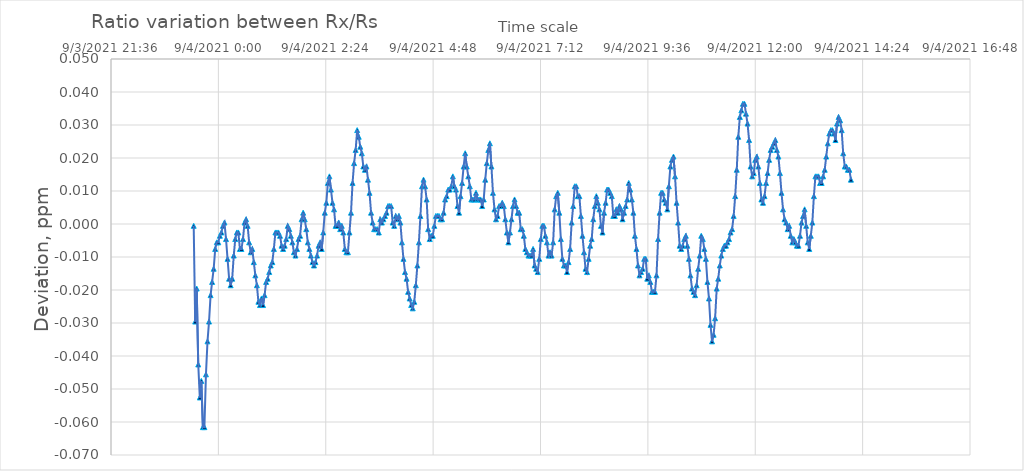
| Category | ratio |
|---|---|
| 44442.977013888885 | -0.001 |
| 44442.9783912037 | -0.03 |
| 44442.97982638889 | -0.02 |
| 44442.981261574074 | -0.043 |
| 44442.98269675926 | -0.053 |
| 44442.984131944446 | -0.048 |
| 44442.98556712963 | -0.062 |
| 44442.98700231482 | -0.062 |
| 44442.9884375 | -0.046 |
| 44442.98987268518 | -0.036 |
| 44442.99130787037 | -0.03 |
| 44442.99275462963 | -0.022 |
| 44442.99417824074 | -0.018 |
| 44442.995625 | -0.014 |
| 44442.99706018518 | -0.008 |
| 44442.99849537037 | -0.006 |
| 44442.999930555554 | -0.006 |
| 44443.00137731482 | -0.004 |
| 44443.0028125 | -0.003 |
| 44443.00424768519 | -0.001 |
| 44443.00568287037 | 0 |
| 44443.00711805555 | -0.005 |
| 44443.00855324074 | -0.011 |
| 44443.01 | -0.017 |
| 44443.01142361111 | -0.019 |
| 44443.012870370374 | -0.017 |
| 44443.01430555555 | -0.01 |
| 44443.01574074074 | -0.005 |
| 44443.017175925925 | -0.003 |
| 44443.01861111111 | -0.003 |
| 44443.02005787037 | -0.008 |
| 44443.02148148148 | -0.008 |
| 44443.02291666667 | -0.005 |
| 44443.024363425924 | 0 |
| 44443.02579861111 | 0.001 |
| 44443.027233796296 | -0.001 |
| 44443.02866898148 | -0.006 |
| 44443.03010416667 | -0.009 |
| 44443.03155092592 | -0.008 |
| 44443.03298611111 | -0.012 |
| 44443.034421296295 | -0.016 |
| 44443.03585648148 | -0.019 |
| 44443.03729166667 | -0.024 |
| 44443.03873842592 | -0.025 |
| 44443.04017361111 | -0.023 |
| 44443.041597222225 | -0.025 |
| 44443.04304398148 | -0.022 |
| 44443.04447916667 | -0.018 |
| 44443.04592592592 | -0.017 |
| 44443.04734953704 | -0.015 |
| 44443.048784722225 | -0.013 |
| 44443.05023148148 | -0.012 |
| 44443.051666666666 | -0.008 |
| 44443.05310185185 | -0.003 |
| 44443.05453703704 | -0.003 |
| 44443.055983796294 | -0.003 |
| 44443.05741898148 | -0.004 |
| 44443.058854166666 | -0.007 |
| 44443.06028935185 | -0.008 |
| 44443.06172453704 | -0.007 |
| 44443.06317129629 | -0.005 |
| 44443.06460648148 | -0.001 |
| 44443.066041666665 | -0.002 |
| 44443.06747685185 | -0.004 |
| 44443.06891203704 | -0.006 |
| 44443.07034722222 | -0.009 |
| 44443.07179398148 | -0.01 |
| 44443.073229166665 | -0.008 |
| 44443.07466435185 | -0.005 |
| 44443.07609953704 | -0.004 |
| 44443.07753472222 | 0.001 |
| 44443.07896990741 | 0.003 |
| 44443.080405092594 | 0.001 |
| 44443.08185185185 | -0.002 |
| 44443.083287037036 | -0.006 |
| 44443.08472222222 | -0.008 |
| 44443.08615740741 | -0.01 |
| 44443.087592592594 | -0.012 |
| 44443.08903935185 | -0.013 |
| 44443.090462962966 | -0.012 |
| 44443.09190972222 | -0.01 |
| 44443.09334490741 | -0.007 |
| 44443.09478009259 | -0.006 |
| 44443.09622685185 | -0.008 |
| 44443.097650462965 | -0.003 |
| 44443.09909722222 | 0.003 |
| 44443.10053240741 | 0.006 |
| 44443.10196759259 | 0.012 |
| 44443.10340277778 | 0.014 |
| 44443.104837962965 | 0.01 |
| 44443.10628472222 | 0.006 |
| 44443.107719907406 | 0.004 |
| 44443.109143518515 | -0.001 |
| 44443.11059027778 | -0.001 |
| 44443.112025462964 | 0 |
| 44443.11347222222 | -0.002 |
| 44443.114907407406 | -0.001 |
| 44443.11633101852 | -0.003 |
| 44443.11777777778 | -0.008 |
| 44443.11921296296 | -0.009 |
| 44443.12064814815 | -0.009 |
| 44443.122083333335 | -0.003 |
| 44443.12351851852 | 0.003 |
| 44443.12496527778 | 0.012 |
| 44443.12640046296 | 0.018 |
| 44443.12783564815 | 0.022 |
| 44443.129270833335 | 0.028 |
| 44443.13070601852 | 0.026 |
| 44443.132152777776 | 0.023 |
| 44443.133576388886 | 0.021 |
| 44443.13501157407 | 0.017 |
| 44443.136458333334 | 0.016 |
| 44443.13789351852 | 0.017 |
| 44443.139328703706 | 0.013 |
| 44443.14076388889 | 0.009 |
| 44443.14221064815 | 0.003 |
| 44443.143645833334 | 0 |
| 44443.14508101852 | -0.002 |
| 44443.146516203706 | -0.002 |
| 44443.14795138889 | -0.002 |
| 44443.14939814815 | -0.003 |
| 44443.150821759256 | 0.001 |
| 44443.15226851852 | 0 |
| 44443.153703703705 | 0.001 |
| 44443.15513888889 | 0.002 |
| 44443.15658564815 | 0.003 |
| 44443.158009259256 | 0.005 |
| 44443.15945601852 | 0.005 |
| 44443.160891203705 | 0.005 |
| 44443.16232638889 | 0 |
| 44443.16376157408 | -0.001 |
| 44443.16519675926 | 0.002 |
| 44443.16664351852 | 0.001 |
| 44443.168078703704 | 0.002 |
| 44443.16950231481 | 0 |
| 44443.170949074076 | -0.006 |
| 44443.17238425926 | -0.011 |
| 44443.17383101852 | -0.015 |
| 44443.17525462963 | -0.017 |
| 44443.17670138889 | -0.021 |
| 44443.178136574075 | -0.023 |
| 44443.17957175926 | -0.025 |
| 44443.18100694445 | -0.026 |
| 44443.182442129626 | -0.024 |
| 44443.18387731481 | -0.019 |
| 44443.185324074075 | -0.013 |
| 44443.186747685184 | -0.006 |
| 44443.18818287037 | 0.002 |
| 44443.18962962963 | 0.011 |
| 44443.19106481481 | 0.013 |
| 44443.1925 | 0.011 |
| 44443.19393518518 | 0.007 |
| 44443.195381944446 | -0.002 |
| 44443.19681712963 | -0.005 |
| 44443.19824074074 | -0.004 |
| 44443.1996875 | -0.004 |
| 44443.20112268518 | -0.001 |
| 44443.202569444446 | 0.002 |
| 44443.203993055555 | 0.002 |
| 44443.20542824074 | 0.002 |
| 44443.206875 | 0.001 |
| 44443.20831018518 | 0.001 |
| 44443.209756944445 | 0.003 |
| 44443.211180555554 | 0.007 |
| 44443.21261574074 | 0.008 |
| 44443.2140625 | 0.01 |
| 44443.21548611111 | 0.01 |
| 44443.21693287037 | 0.011 |
| 44443.21836805555 | 0.014 |
| 44443.21980324074 | 0.011 |
| 44443.22125 | 0.01 |
| 44443.22267361111 | 0.005 |
| 44443.22412037037 | 0.003 |
| 44443.22555555555 | 0.008 |
| 44443.22697916667 | 0.012 |
| 44443.228425925925 | 0.017 |
| 44443.22986111111 | 0.021 |
| 44443.231307870374 | 0.017 |
| 44443.23274305555 | 0.014 |
| 44443.23416666667 | 0.011 |
| 44443.235613425924 | 0.007 |
| 44443.23704861111 | 0.007 |
| 44443.23849537037 | 0.007 |
| 44443.23991898148 | 0.009 |
| 44443.24135416667 | 0.007 |
| 44443.242800925924 | 0.007 |
| 44443.24423611111 | 0.007 |
| 44443.245671296296 | 0.005 |
| 44443.24710648148 | 0.007 |
| 44443.24854166667 | 0.013 |
| 44443.24998842592 | 0.018 |
| 44443.25141203704 | 0.022 |
| 44443.252847222226 | 0.024 |
| 44443.25429398148 | 0.017 |
| 44443.25572916667 | 0.009 |
| 44443.25716435185 | 0.004 |
| 44443.25859953704 | 0.001 |
| 44443.260046296295 | 0.002 |
| 44443.26148148148 | 0.005 |
| 44443.26290509259 | 0.005 |
| 44443.26435185185 | 0.006 |
| 44443.26578703704 | 0.005 |
| 44443.267222222225 | 0.001 |
| 44443.26865740741 | -0.003 |
| 44443.27009259259 | -0.006 |
| 44443.27153935185 | -0.003 |
| 44443.27297453704 | 0.001 |
| 44443.274409722224 | 0.005 |
| 44443.27584490741 | 0.007 |
| 44443.277291666665 | 0.005 |
| 44443.27872685185 | 0.003 |
| 44443.28015046296 | 0.003 |
| 44443.28159722222 | -0.002 |
| 44443.28303240741 | -0.002 |
| 44443.28445601852 | -0.004 |
| 44443.28590277778 | -0.008 |
| 44443.28733796296 | -0.009 |
| 44443.28878472222 | -0.01 |
| 44443.29021990741 | -0.01 |
| 44443.291655092595 | -0.01 |
| 44443.29309027778 | -0.008 |
| 44443.29452546296 | -0.013 |
| 44443.295960648145 | -0.014 |
| 44443.29739583333 | -0.015 |
| 44443.298842592594 | -0.011 |
| 44443.3002662037 | -0.005 |
| 44443.30170138889 | -0.001 |
| 44443.303136574075 | -0.001 |
| 44443.30458333333 | -0.004 |
| 44443.30601851852 | -0.006 |
| 44443.3074537037 | -0.01 |
| 44443.30888888889 | -0.009 |
| 44443.31033564815 | -0.01 |
| 44443.31177083333 | -0.006 |
| 44443.313206018516 | 0.004 |
| 44443.3146412037 | 0.008 |
| 44443.31607638889 | 0.009 |
| 44443.31752314815 | 0.003 |
| 44443.31895833334 | -0.005 |
| 44443.320381944446 | -0.011 |
| 44443.3218287037 | -0.013 |
| 44443.32326388889 | -0.013 |
| 44443.32471064815 | -0.015 |
| 44443.32613425926 | -0.012 |
| 44443.327581018515 | -0.008 |
| 44443.3290162037 | 0 |
| 44443.33043981482 | 0.005 |
| 44443.33188657407 | 0.011 |
| 44443.33332175926 | 0.011 |
| 44443.334756944445 | 0.008 |
| 44443.33619212963 | 0.008 |
| 44443.33762731482 | 0.002 |
| 44443.33907407407 | -0.004 |
| 44443.34050925926 | -0.009 |
| 44443.341944444444 | -0.014 |
| 44443.34337962963 | -0.015 |
| 44443.344814814816 | -0.011 |
| 44443.34625 | -0.007 |
| 44443.34768518519 | -0.005 |
| 44443.34912037037 | 0.001 |
| 44443.35056712963 | 0.005 |
| 44443.352002314816 | 0.008 |
| 44443.3534375 | 0.006 |
| 44443.35487268519 | 0.004 |
| 44443.356307870374 | -0.001 |
| 44443.35774305555 | -0.003 |
| 44443.35917824074 | 0.003 |
| 44443.360625 | 0.006 |
| 44443.36206018519 | 0.01 |
| 44443.36349537037 | 0.01 |
| 44443.36493055556 | 0.009 |
| 44443.36636574074 | 0.008 |
| 44443.3678125 | 0.002 |
| 44443.36924768519 | 0.002 |
| 44443.370671296296 | 0.004 |
| 44443.37211805556 | 0.003 |
| 44443.37355324074 | 0.005 |
| 44443.375 | 0.004 |
| 44443.37642361111 | 0.001 |
| 44443.377858796295 | 0.003 |
| 44443.37930555556 | 0.005 |
| 44443.380740740744 | 0.007 |
| 44443.38217592592 | 0.012 |
| 44443.38361111111 | 0.01 |
| 44443.38505787037 | 0.007 |
| 44443.38649305556 | 0.003 |
| 44443.38791666667 | -0.004 |
| 44443.38936342593 | -0.008 |
| 44443.39079861111 | -0.013 |
| 44443.392233796294 | -0.016 |
| 44443.39366898148 | -0.015 |
| 44443.39511574074 | -0.014 |
| 44443.39655092593 | -0.011 |
| 44443.39797453704 | -0.011 |
| 44443.39942129629 | -0.017 |
| 44443.40085648148 | -0.016 |
| 44443.402291666665 | -0.018 |
| 44443.40373842593 | -0.021 |
| 44443.405173611114 | -0.021 |
| 44443.40660879629 | -0.021 |
| 44443.40804398148 | -0.016 |
| 44443.40949074074 | -0.005 |
| 44443.41091435185 | 0.003 |
| 44443.41234953704 | 0.009 |
| 44443.4137962963 | 0.009 |
| 44443.41521990741 | 0.007 |
| 44443.416666666664 | 0.006 |
| 44443.41810185185 | 0.004 |
| 44443.419537037036 | 0.011 |
| 44443.42097222222 | 0.017 |
| 44443.42240740741 | 0.019 |
| 44443.423842592594 | 0.02 |
| 44443.42528935185 | 0.014 |
| 44443.426724537036 | 0.006 |
| 44443.428148148145 | 0 |
| 44443.42959490741 | -0.007 |
| 44443.43103009259 | -0.008 |
| 44443.43247685185 | -0.007 |
| 44443.433900462966 | -0.005 |
| 44443.43533564815 | -0.004 |
| 44443.43678240741 | -0.007 |
| 44443.43821759259 | -0.011 |
| 44443.43966435185 | -0.016 |
| 44443.441087962965 | -0.02 |
| 44443.44252314815 | -0.021 |
| 44443.44396990741 | -0.022 |
| 44443.445393518516 | -0.019 |
| 44443.44684027778 | -0.014 |
| 44443.448275462964 | -0.01 |
| 44443.44972222222 | -0.004 |
| 44443.451157407406 | -0.005 |
| 44443.452581018515 | -0.008 |
| 44443.45402777778 | -0.011 |
| 44443.455462962964 | -0.018 |
| 44443.45689814815 | -0.023 |
| 44443.458333333336 | -0.031 |
| 44443.45976851852 | -0.036 |
| 44443.46121527778 | -0.034 |
| 44443.46263888889 | -0.029 |
| 44443.46408564815 | -0.02 |
| 44443.465520833335 | -0.017 |
| 44443.46695601852 | -0.013 |
| 44443.46839120371 | -0.01 |
| 44443.469826388886 | -0.008 |
| 44443.47127314815 | -0.007 |
| 44443.472708333335 | -0.007 |
| 44443.474131944444 | -0.006 |
| 44443.47557870371 | -0.005 |
| 44443.477013888885 | -0.003 |
| 44443.47846064815 | -0.002 |
| 44443.47988425926 | 0.002 |
| 44443.48131944444 | 0.008 |
| 44443.482766203706 | 0.016 |
| 44443.48420138889 | 0.026 |
| 44443.48564814815 | 0.032 |
| 44443.48707175926 | 0.034 |
| 44443.48850694444 | 0.036 |
| 44443.489953703705 | 0.036 |
| 44443.491377314815 | 0.033 |
| 44443.4928125 | 0.03 |
| 44443.494259259256 | 0.025 |
| 44443.49569444444 | 0.017 |
| 44443.497141203705 | 0.014 |
| 44443.498564814814 | 0.015 |
| 44443.5 | 0.019 |
| 44443.50144675926 | 0.02 |
| 44443.50288194444 | 0.017 |
| 44443.50431712963 | 0.012 |
| 44443.50575231481 | 0.007 |
| 44443.507199074076 | 0.006 |
| 44443.50863425926 | 0.008 |
| 44443.51006944444 | 0.012 |
| 44443.51150462963 | 0.015 |
| 44443.51293981481 | 0.019 |
| 44443.514386574076 | 0.022 |
| 44443.51582175926 | 0.023 |
| 44443.51725694445 | 0.024 |
| 44443.518692129626 | 0.025 |
| 44443.52012731481 | 0.022 |
| 44443.5215625 | 0.02 |
| 44443.522997685184 | 0.015 |
| 44443.52443287037 | 0.009 |
| 44443.525868055556 | 0.004 |
| 44443.52730324074 | 0.001 |
| 44443.52873842593 | 0 |
| 44443.530185185184 | -0.002 |
| 44443.53162037037 | -0.001 |
| 44443.533055555556 | -0.004 |
| 44443.53449074074 | -0.006 |
| 44443.5359375 | -0.005 |
| 44443.53736111111 | -0.006 |
| 44443.5387962963 | -0.007 |
| 44443.540243055555 | -0.007 |
| 44443.54167824074 | -0.004 |
| 44443.54311342593 | 0 |
| 44443.54454861111 | 0.002 |
| 44443.5459837963 | 0.004 |
| 44443.547430555554 | -0.001 |
| 44443.54886574074 | -0.006 |
| 44443.55030092593 | -0.008 |
| 44443.55173611111 | -0.004 |
| 44443.5531712963 | 0 |
| 44443.554606481484 | 0.008 |
| 44443.55604166666 | 0.014 |
| 44443.55747685185 | 0.014 |
| 44443.55892361111 | 0.014 |
| 44443.5603587963 | 0.012 |
| 44443.56180555555 | 0.012 |
| 44443.56322916667 | 0.014 |
| 44443.564675925925 | 0.016 |
| 44443.56611111111 | 0.02 |
| 44443.5675462963 | 0.024 |
| 44443.56898148148 | 0.027 |
| 44443.57041666667 | 0.028 |
| 44443.571863425925 | 0.028 |
| 44443.57329861111 | 0.027 |
| 44443.57472222222 | 0.025 |
| 44443.57616898148 | 0.03 |
| 44443.57760416667 | 0.032 |
| 44443.579050925924 | 0.031 |
| 44443.58047453704 | 0.028 |
| 44443.58190972222 | 0.021 |
| 44443.58335648148 | 0.017 |
| 44443.58479166667 | 0.017 |
| 44443.586226851854 | 0.016 |
| 44443.58766203704 | 0.016 |
| 44443.58909722222 | 0.013 |